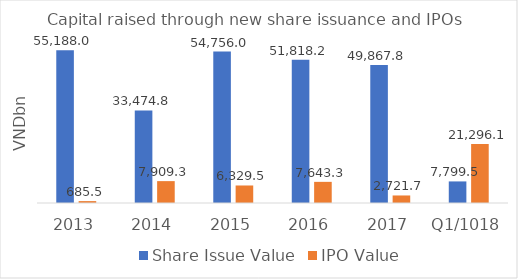
| Category | Share Issue Value | IPO Value |
|---|---|---|
| 2013 | 55188.031 | 685.523 |
| 2014 | 33474.817 | 7909.26 |
| 2015 | 54756.019 | 6329.543 |
| 2016 | 51818.172 | 7643.259 |
| 2017 | 49867.82 | 2721.717 |
| Q1/1018 | 7799.503 | 21296.093 |